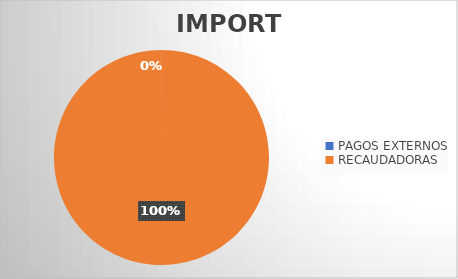
| Category | IMPORTE |
|---|---|
| PAGOS EXTERNOS | 265400.94 |
| RECAUDADORAS | 1545945479.94 |